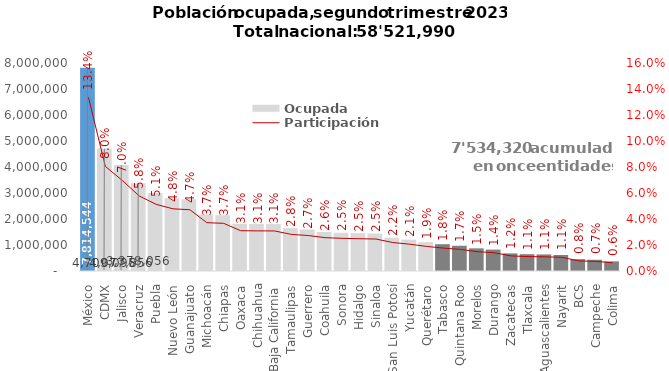
| Category | Ocupada |
|---|---|
| México | 7814544 |
| CDMX | 4709095 |
| Jalisco | 4077856 |
| Veracruz | 3378056 |
| Puebla | 3001762 |
| Nuevo León | 2798776 |
| Guanajuato | 2757893 |
| Michoacán | 2176263 |
| Chiapas | 2145825 |
| Oaxaca | 1814054 |
| Chihuahua | 1806446 |
| Baja California | 1803781 |
| Tamaulipas | 1648370 |
| Guerrero | 1596344 |
| Coahuila | 1500351 |
| Sonora | 1470217 |
| Hidalgo | 1453844 |
| Sinaloa | 1439375 |
| San Luis Potosí | 1281637 |
| Yucatán | 1206186 |
| Querétaro | 1106995 |
| Tabasco | 1030881 |
| Quintana Roo | 970935 |
| Morelos | 870630 |
| Durango | 823286 |
| Zacatecas | 678238 |
| Tlaxcala | 647938 |
| Aguascalientes | 637605 |
| Nayarit | 615368 |
| BCS | 456252 |
| Campeche | 432941 |
| Colima | 370246 |